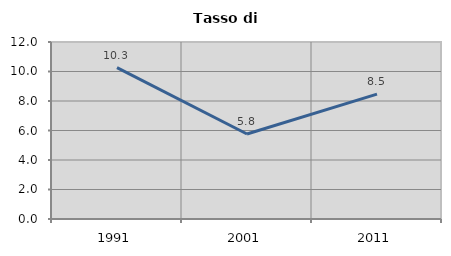
| Category | Tasso di disoccupazione   |
|---|---|
| 1991.0 | 10.261 |
| 2001.0 | 5.761 |
| 2011.0 | 8.466 |